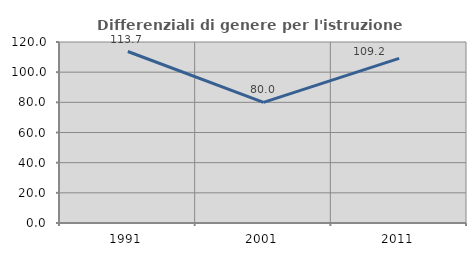
| Category | Differenziali di genere per l'istruzione superiore |
|---|---|
| 1991.0 | 113.684 |
| 2001.0 | 80 |
| 2011.0 | 109.155 |